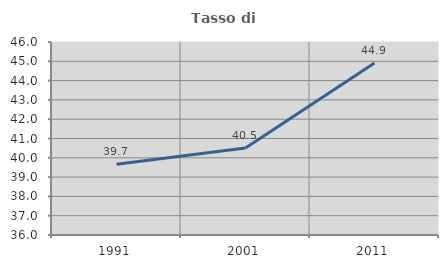
| Category | Tasso di occupazione   |
|---|---|
| 1991.0 | 39.662 |
| 2001.0 | 40.508 |
| 2011.0 | 44.907 |